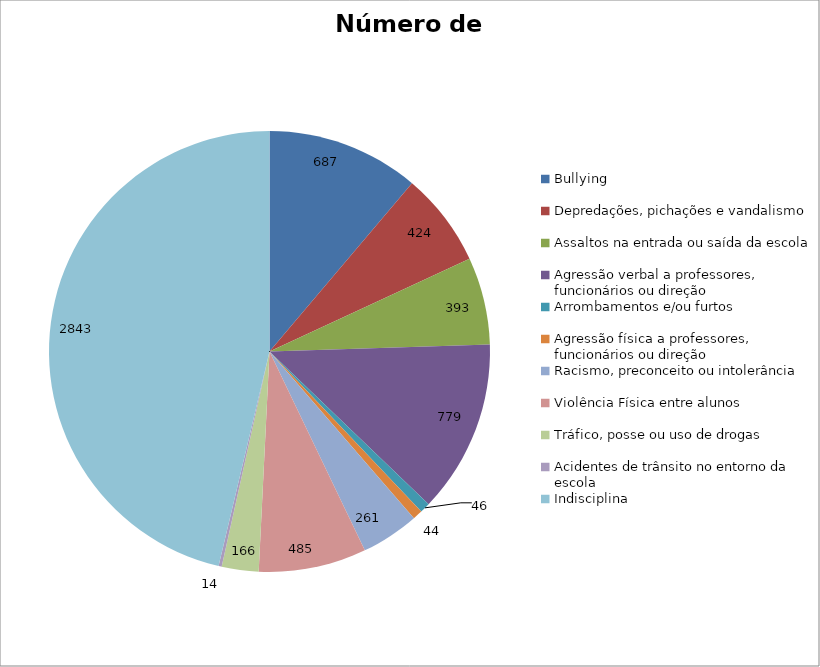
| Category | Número de Casos |
|---|---|
| Bullying | 687 |
| Depredações, pichações e vandalismo | 424 |
| Assaltos na entrada ou saída da escola | 393 |
| Agressão verbal a professores, funcionários ou direção | 779 |
| Arrombamentos e/ou furtos | 46 |
| Agressão física a professores, funcionários ou direção | 44 |
| Racismo, preconceito ou intolerância | 261 |
| Violência Física entre alunos | 485 |
| Tráfico, posse ou uso de drogas | 166 |
| Acidentes de trânsito no entorno da escola | 14 |
| Indisciplina | 2843 |